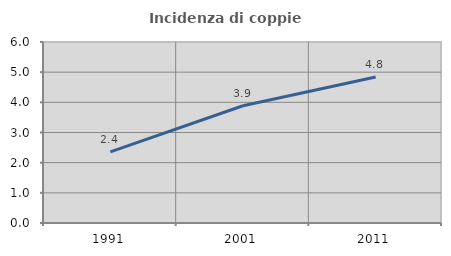
| Category | Incidenza di coppie miste |
|---|---|
| 1991.0 | 2.36 |
| 2001.0 | 3.887 |
| 2011.0 | 4.84 |